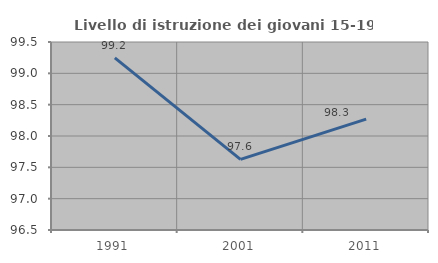
| Category | Livello di istruzione dei giovani 15-19 anni |
|---|---|
| 1991.0 | 99.246 |
| 2001.0 | 97.627 |
| 2011.0 | 98.27 |